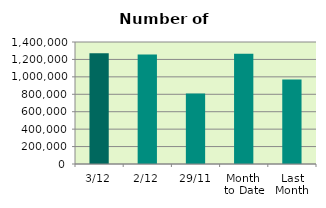
| Category | Series 0 |
|---|---|
| 3/12 | 1271942 |
| 2/12 | 1255750 |
| 29/11 | 807754 |
| Month 
to Date | 1263846 |
| Last
Month | 969317.238 |